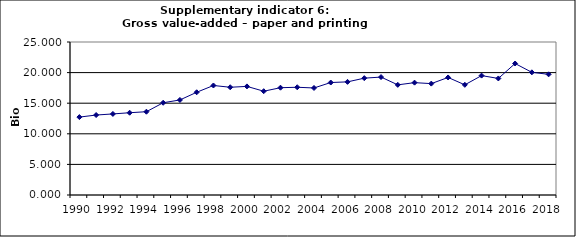
| Category | Gross value-added – paper and printing industry, Bio Euro (EC95) |
|---|---|
| 1990 | 12.729 |
| 1991 | 13.065 |
| 1992 | 13.247 |
| 1993 | 13.444 |
| 1994 | 13.608 |
| 1995 | 15.074 |
| 1996 | 15.531 |
| 1997 | 16.786 |
| 1998 | 17.892 |
| 1999 | 17.605 |
| 2000 | 17.746 |
| 2001 | 16.959 |
| 2002 | 17.53 |
| 2003 | 17.605 |
| 2004 | 17.487 |
| 2005 | 18.38 |
| 2006 | 18.485 |
| 2007 | 19.092 |
| 2008 | 19.271 |
| 2009 | 17.997 |
| 2010 | 18.358 |
| 2011 | 18.201 |
| 2012 | 19.208 |
| 2013 | 18.002 |
| 2014 | 19.51 |
| 2015 | 19.046 |
| 2016 | 21.486 |
| 2017 | 20.043 |
| 2018 | 19.717 |